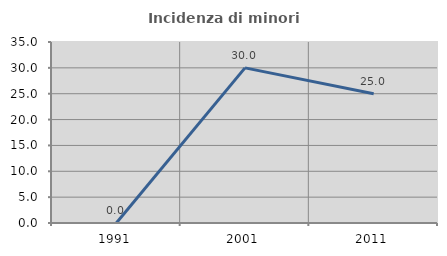
| Category | Incidenza di minori stranieri |
|---|---|
| 1991.0 | 0 |
| 2001.0 | 30 |
| 2011.0 | 25 |